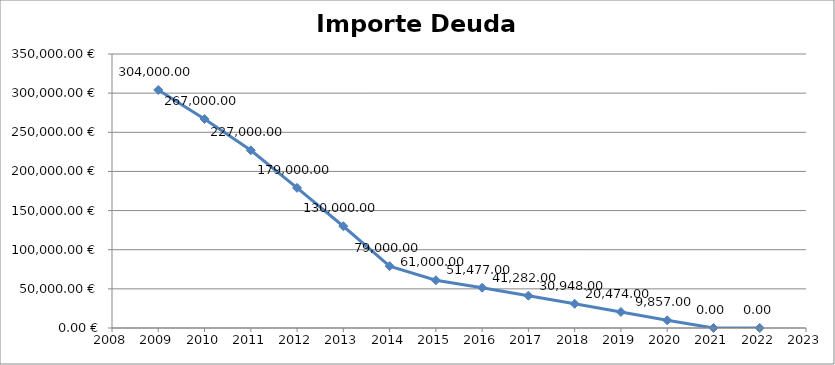
| Category | Importe deuda viva  |
|---|---|
| 2009.0 | 304000 |
| 2010.0 | 267000 |
| 2011.0 | 227000 |
| 2012.0 | 179000 |
| 2013.0 | 130000 |
| 2014.0 | 79000 |
| 2015.0 | 61000 |
| 2016.0 | 51477 |
| 2017.0 | 41282 |
| 2018.0 | 30948 |
| 2019.0 | 20474 |
| 2020.0 | 9857 |
| 2021.0 | 0 |
| 2022.0 | 0 |